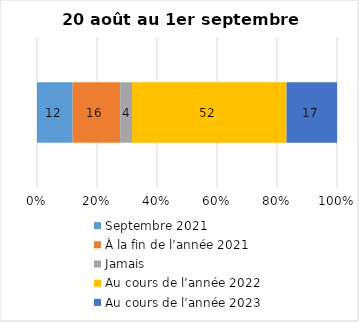
| Category | Septembre 2021 | À la fin de l’année 2021 | Jamais | Au cours de l’année 2022 | Au cours de l’année 2023 |
|---|---|---|---|---|---|
| 0 | 12 | 16 | 4 | 52 | 17 |